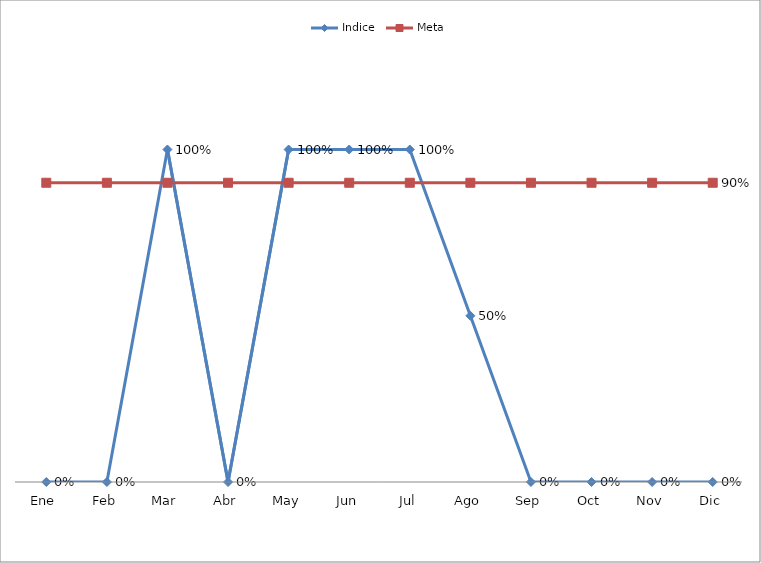
| Category | Indice | Meta |
|---|---|---|
| Ene | 0 | 0.9 |
| Feb | 0 | 0.9 |
| Mar | 1 | 0.9 |
| Abr | 0 | 0.9 |
| May | 1 | 0.9 |
| Jun | 1 | 0.9 |
| Jul | 1 | 0.9 |
| Ago | 0.5 | 0.9 |
| Sep | 0 | 0.9 |
| Oct | 0 | 0.9 |
| Nov | 0 | 0.9 |
| Dic | 0 | 0.9 |